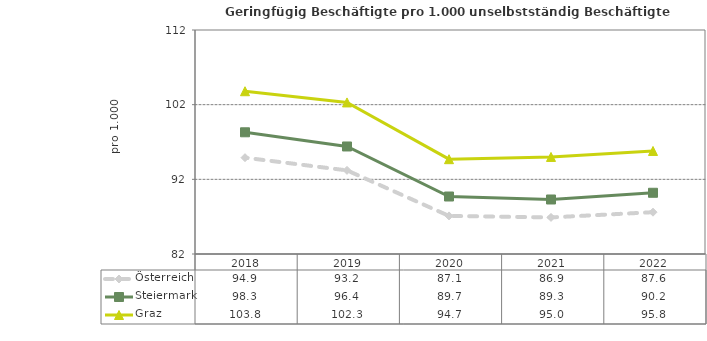
| Category | Österreich | Steiermark | Graz |
|---|---|---|---|
| 2022.0 | 87.6 | 90.2 | 95.8 |
| 2021.0 | 86.9 | 89.3 | 95 |
| 2020.0 | 87.1 | 89.7 | 94.7 |
| 2019.0 | 93.2 | 96.4 | 102.3 |
| 2018.0 | 94.9 | 98.3 | 103.8 |